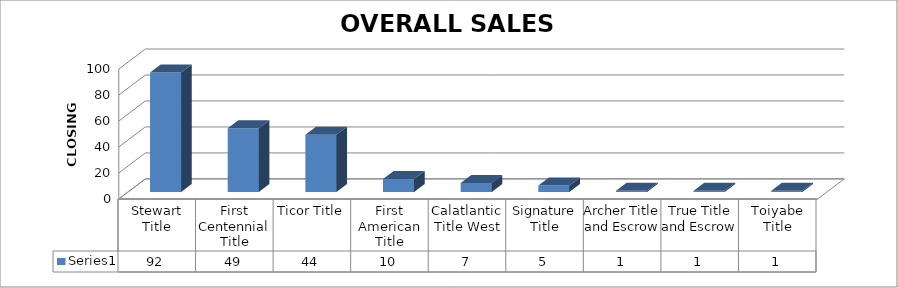
| Category | Series 0 |
|---|---|
| Stewart Title | 92 |
| First Centennial Title | 49 |
| Ticor Title | 44 |
| First American Title | 10 |
| Calatlantic Title West | 7 |
| Signature Title | 5 |
| Archer Title and Escrow | 1 |
| True Title and Escrow | 1 |
| Toiyabe Title | 1 |